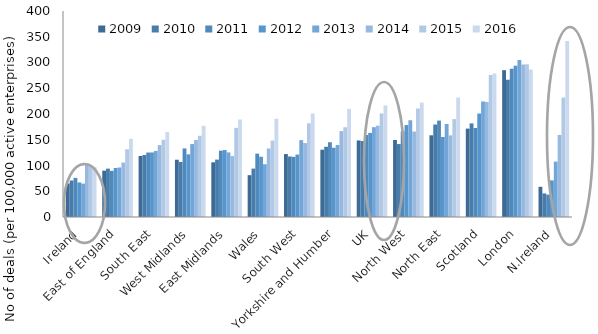
| Category | 2009 | 2010 | 2011 | 2012 | 2013 | 2014 | 2015 | 2016 |
|---|---|---|---|---|---|---|---|---|
| Ireland | 65.05 | 70.872 | 75.971 | 67.105 | 64.868 | 103.253 | 99.259 | 96.988 |
| East of England | 89.985 | 93.934 | 89.601 | 95.162 | 96.156 | 105.764 | 131.512 | 151.904 |
| South East | 118.479 | 120.324 | 125.139 | 125.322 | 128.301 | 139.678 | 149.902 | 164.907 |
| West Midlands | 111.198 | 106.853 | 133.109 | 121.652 | 141.571 | 149.423 | 157.707 | 177.038 |
| East Midlands | 106.248 | 111.444 | 128.808 | 129.97 | 125.392 | 118.308 | 173.079 | 189.269 |
| Wales | 81.207 | 93.99 | 123.039 | 117.065 | 102.507 | 133.052 | 148.405 | 190.917 |
| South West | 122.187 | 117.482 | 116.805 | 121.206 | 149.296 | 143.582 | 181.97 | 200.93 |
| Yorkshire and Humber | 130.676 | 136.335 | 145.183 | 134.467 | 139.84 | 166.817 | 174.324 | 209.809 |
| UK | 148.64 | 147.485 | 159.225 | 163.256 | 174.293 | 177.311 | 201.046 | 216.564 |
| North West | 149.516 | 141.613 | 166.418 | 178.571 | 187.858 | 165.955 | 210.595 | 222.058 |
| North East | 158.655 | 179.485 | 187.183 | 155.355 | 180.604 | 158.488 | 190.114 | 231.853 |
| Scotland | 171.608 | 181.766 | 172.818 | 200.859 | 224.373 | 223.4 | 275.898 | 278.859 |
| London | 285.1 | 266.66 | 287.997 | 293.806 | 304.633 | 295.912 | 296.503 | 286.512 |
| N.Ireland | 58.626 | 45.774 | 43.577 | 71.105 | 107.565 | 159.305 | 231.894 | 341.824 |